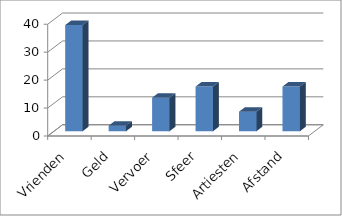
| Category | Series 0 |
|---|---|
| Vrienden | 38 |
| Geld | 2 |
| Vervoer | 12 |
| Sfeer | 16 |
| Artiesten | 7 |
| Afstand | 16 |